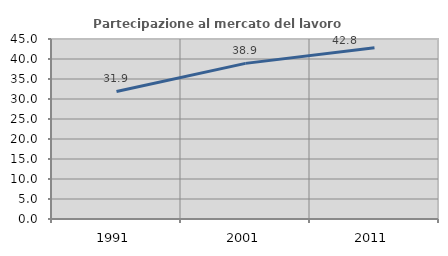
| Category | Partecipazione al mercato del lavoro  femminile |
|---|---|
| 1991.0 | 31.881 |
| 2001.0 | 38.905 |
| 2011.0 | 42.818 |